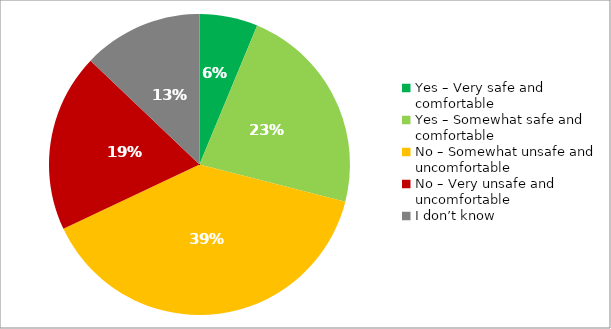
| Category | Responses |
|---|---|
| Yes – Very safe and comfortable | 0.063 |
| Yes – Somewhat safe and comfortable | 0.227 |
| No – Somewhat unsafe and uncomfortable | 0.39 |
| No – Very unsafe and uncomfortable | 0.191 |
| I don’t know | 0.129 |